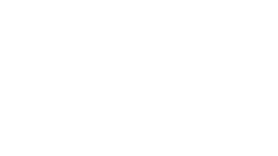
| Category | Series 0 |
|---|---|
| Ch.App.1 | 0 |
| Ch.App.2 | 0 |
| Ch.App.3 | 0 |
| Ch.App.4 | 0 |